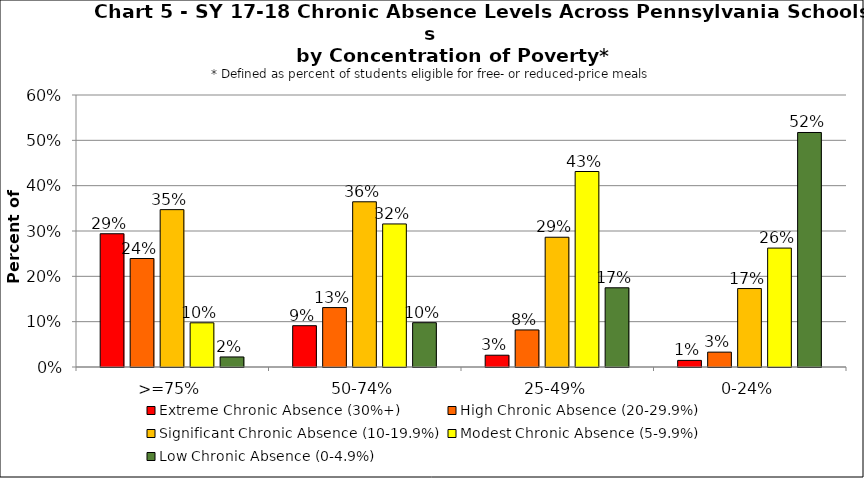
| Category | Extreme Chronic Absence (30%+) | High Chronic Absence (20-29.9%) | Significant Chronic Absence (10-19.9%) | Modest Chronic Absence (5-9.9%) | Low Chronic Absence (0-4.9%) |
|---|---|---|---|---|---|
| 0 | 0.294 | 0.239 | 0.347 | 0.097 | 0.022 |
| 1 | 0.091 | 0.131 | 0.364 | 0.316 | 0.098 |
| 2 | 0.026 | 0.082 | 0.286 | 0.431 | 0.175 |
| 3 | 0.015 | 0.033 | 0.173 | 0.262 | 0.517 |